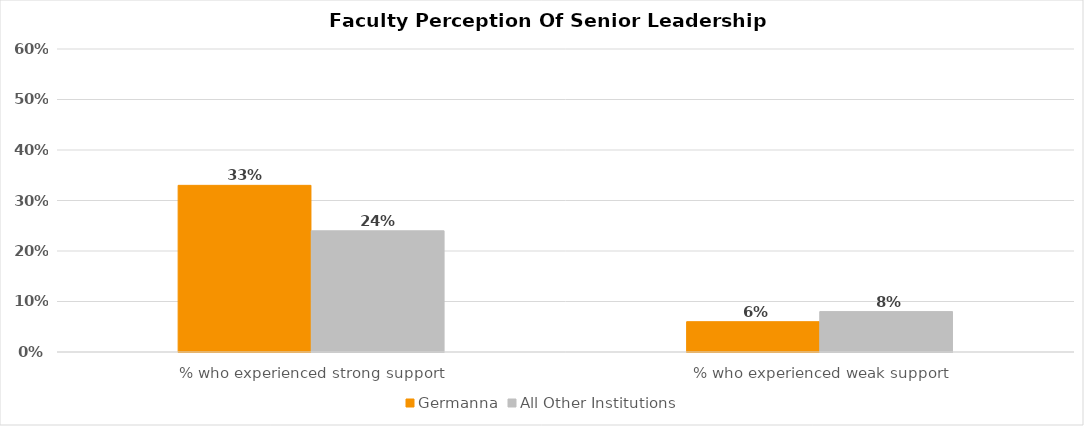
| Category | Germanna | All Other Institutions |
|---|---|---|
| % who experienced strong support | 0.33 | 0.24 |
| % who experienced weak support | 0.06 | 0.08 |